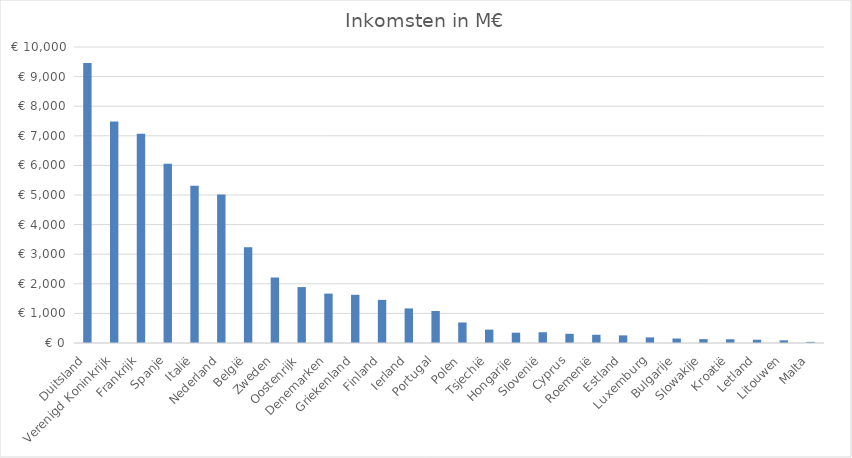
| Category | Inkomsten in M€ |
|---|---|
| Duitsland | 9457.461 |
| Verenigd Koninkrijk | 7480.501 |
| Frankrijk | 7068.186 |
| Spanje | 6056.406 |
| Italië | 5309.298 |
| Nederland | 5016.31 |
| België | 3237.366 |
| Zweden | 2212.556 |
| Oostenrijk | 1888.587 |
| Denemarken | 1668.5 |
| Griekenland | 1628.979 |
| Finland | 1456.944 |
| Ierland | 1167.879 |
| Portugal | 1081.554 |
| Polen | 692.79 |
| Tsjechië | 451.515 |
| Hongarije | 348.39 |
| Slovenië | 362.785 |
| Cyprus | 310.869 |
| Roemenië | 278.74 |
| Estland | 256.835 |
| Luxemburg | 190.148 |
| Bulgarije | 151.346 |
| Slowakije | 130.599 |
| Kroatië | 126.275 |
| Letland | 111.508 |
| Litouwen | 90.638 |
| Malta | 37.551 |